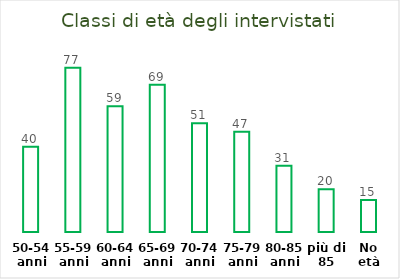
| Category | Classi di età degli intervistati |
|---|---|
| 50-54 anni | 40 |
| 55-59 anni | 77 |
| 60-64 anni | 59 |
| 65-69 anni | 69 |
| 70-74 anni | 51 |
| 75-79 anni | 47 |
| 80-85 anni | 31 |
| più di 85 | 20 |
| No età | 15 |